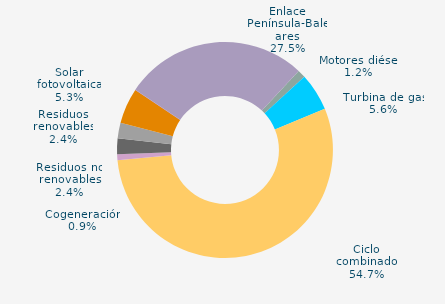
| Category | Series 0 |
|---|---|
| Carbón | 0 |
| Motores diésel | 1.186 |
| Turbina de gas | 5.64 |
| Ciclo combinado | 54.713 |
| Generación auxiliar | 0 |
| Cogeneración | 0.883 |
| Residuos no renovables | 2.351 |
| Residuos renovables | 2.351 |
| Eólica | 0 |
| Solar fotovoltaica | 5.329 |
| Otras renovables | 0.023 |
| Enlace Península-Baleares | 27.525 |